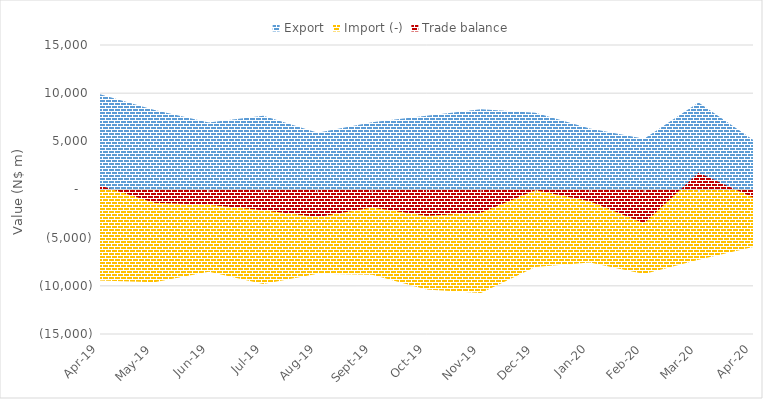
| Category | Export | Import (-) | Trade balance |
|---|---|---|---|
| 2019-04-19 | 9875.04 | -9450.64 | 424.4 |
| 2019-05-19 | 8263.743 | -9628.755 | -1365.011 |
| 2019-06-19 | 6955.963 | -8543.61 | -1587.646 |
| 2019-07-19 | 7647.586 | -9809.407 | -2161.821 |
| 2019-08-19 | 5898.805 | -8757.963 | -2859.159 |
| 2019-09-19 | 6980.182 | -8849.394 | -1869.212 |
| 2019-10-19 | 7647.287 | -10371.802 | -2724.515 |
| 2019-11-19 | 8333.836 | -10745.594 | -2411.758 |
| 2019-12-19 | 7978.659 | -8044.262 | -65.603 |
| 2020-01-19 | 6342.84 | -7567.069 | -1224.228 |
| 2020-02-19 | 5257.425 | -8764.847 | -3507.422 |
| 2020-03-19 | 9036.181 | -7304.994 | 1731.187 |
| 2020-04-19 | 5153.844 | -5979.9 | -826.056 |